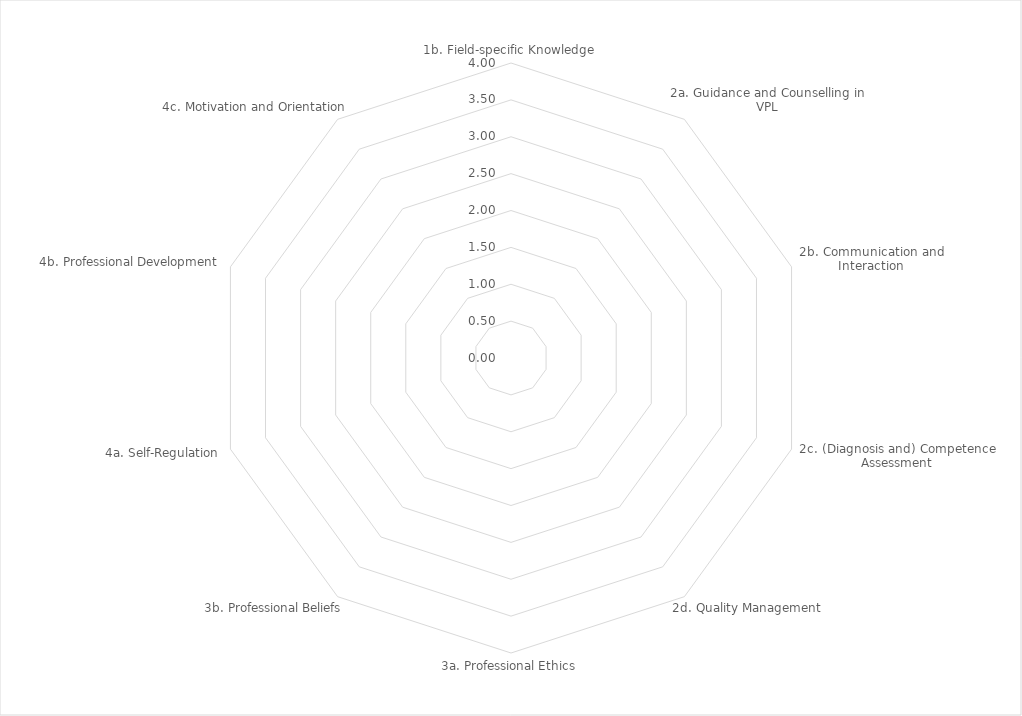
| Category | Series 0 |
|---|---|
| 1b. Field-specific Knowledge | 0 |
| 2a. Guidance and Counselling in VPL | 0 |
| 2b. Communication and Interaction | 0 |
| 2c. (Diagnosis and) Competence Assessment | 0 |
| 2d. Quality Management | 0 |
| 3a. Professional Ethics | 0 |
| 3b. Professional Beliefs | 0 |
| 4a. Self-Regulation | 0 |
| 4b. Professional Development | 0 |
| 4c. Motivation and Orientation  | 0 |